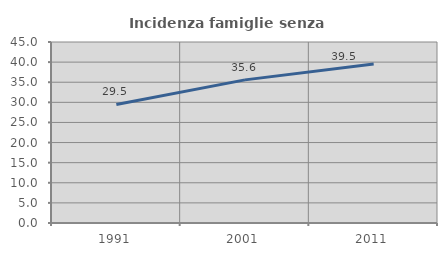
| Category | Incidenza famiglie senza nuclei |
|---|---|
| 1991.0 | 29.48 |
| 2001.0 | 35.586 |
| 2011.0 | 39.542 |